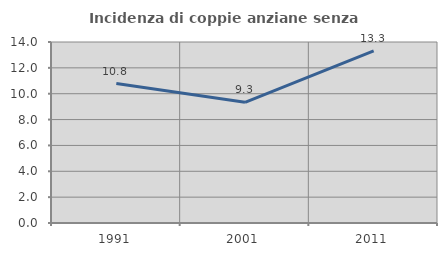
| Category | Incidenza di coppie anziane senza figli  |
|---|---|
| 1991.0 | 10.782 |
| 2001.0 | 9.333 |
| 2011.0 | 13.316 |